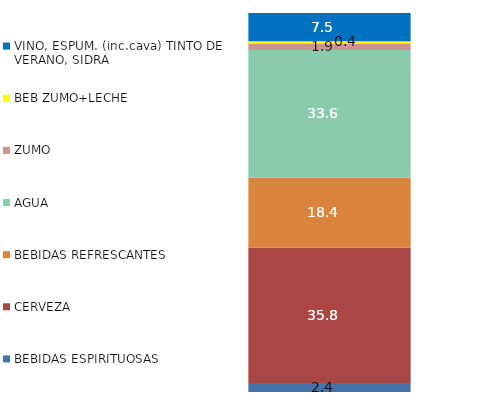
| Category |  BEBIDAS ESPIRITUOSAS  |  CERVEZA  |  BEBIDAS REFRESCANTES  |  AGUA  |  ZUMO  |  BEB ZUMO+LECHE  |  VINO, ESPUM. (inc.cava) TINTO DE VERANO, SIDRA  |
|---|---|---|---|---|---|---|---|
| 0 | 2.36 | 35.795 | 18.43 | 33.636 | 1.945 | 0.362 | 7.472 |